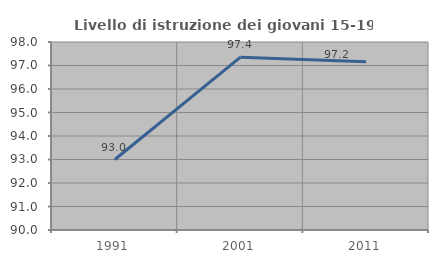
| Category | Livello di istruzione dei giovani 15-19 anni |
|---|---|
| 1991.0 | 93 |
| 2001.0 | 97.354 |
| 2011.0 | 97.159 |